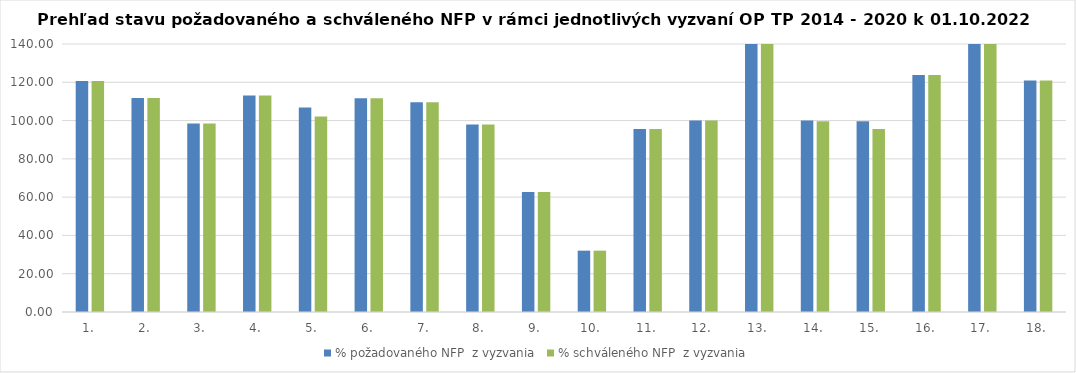
| Category | % požadovaného NFP  z vyzvania | % schváleného NFP  z vyzvania |
|---|---|---|
| 1. | 120.673 | 120.673 |
| 2. | 111.84 | 111.84 |
| 3. | 98.474 | 98.474 |
| 4. | 113.162 | 113.162 |
| 5. | 106.767 | 102.19 |
| 6. | 111.66 | 111.66 |
| 7. | 109.515 | 109.515 |
| 8. | 97.998 | 97.998 |
| 9. | 62.727 | 62.727 |
| 10. | 32.041 | 32.041 |
| 11. | 95.621 | 95.621 |
| 12. | 100.009 | 100.009 |
| 13. | 151.956 | 151.956 |
| 14. | 99.986 | 99.613 |
| 15. | 99.609 | 95.654 |
| 16. | 123.771 | 123.771 |
| 17. | 171.931 | 171.931 |
| 18. | 120.879 | 120.879 |